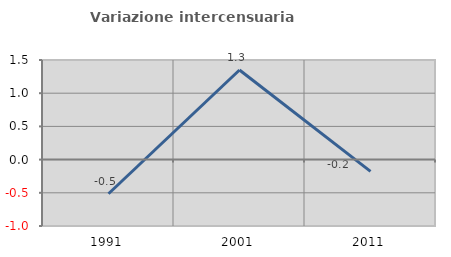
| Category | Variazione intercensuaria annua |
|---|---|
| 1991.0 | -0.515 |
| 2001.0 | 1.349 |
| 2011.0 | -0.177 |